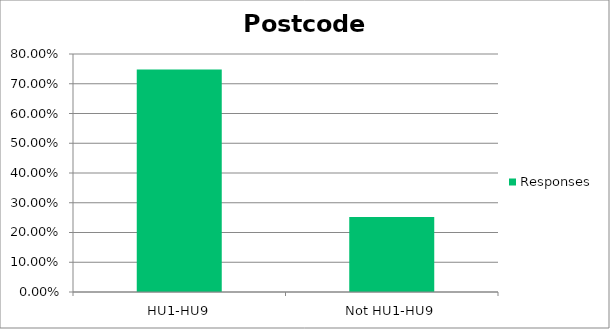
| Category | Responses |
|---|---|
| HU1-HU9 | 0.748 |
| Not HU1-HU9 | 0.252 |